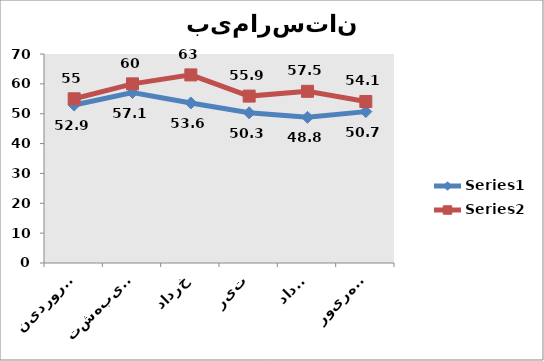
| Category | Series 0 | Series 1 |
|---|---|---|
| فروردین | 52.9 | 55 |
| اردیبهشت | 57.1 | 60 |
| خرداد | 53.6 | 63 |
| تیر | 50.3 | 55.9 |
| مرداد | 48.8 | 57.5 |
| شهریور | 50.7 | 54.1 |